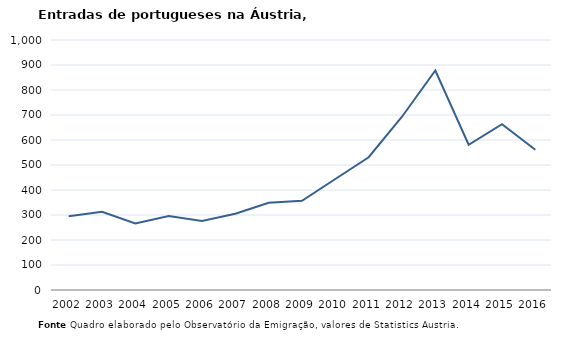
| Category | Entradas |
|---|---|
| 2002.0 | 295 |
| 2003.0 | 313 |
| 2004.0 | 266 |
| 2005.0 | 296 |
| 2006.0 | 276 |
| 2007.0 | 305 |
| 2008.0 | 349 |
| 2009.0 | 357 |
| 2010.0 | 444 |
| 2011.0 | 531 |
| 2012.0 | 693 |
| 2013.0 | 878 |
| 2014.0 | 581 |
| 2015.0 | 663 |
| 2016.0 | 561 |